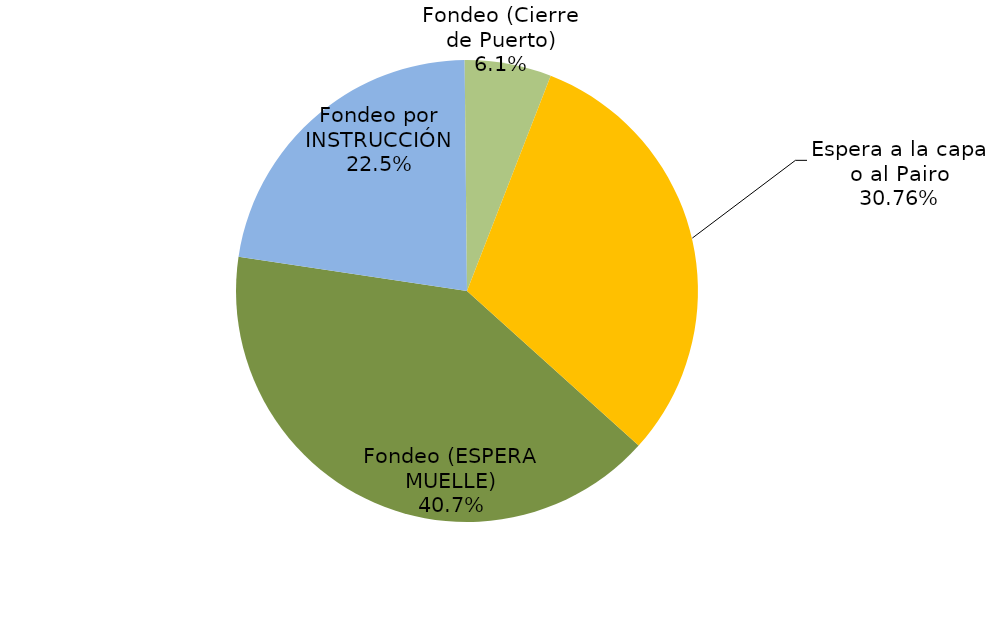
| Category | Series 0 |
|---|---|
| Fondeo (ESPERA MUELLE) | 9293.6 |
| Fondeo por INSTRUCCIÓN | 5128.767 |
| Fondeo (Cierre de Puerto) | 1385.217 |
| Espera a la capa o al Pairo | 7023.217 |